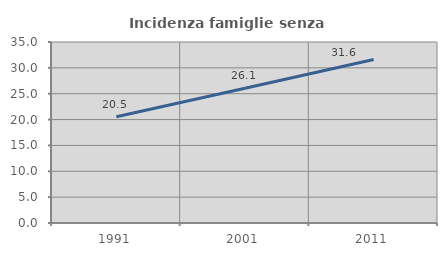
| Category | Incidenza famiglie senza nuclei |
|---|---|
| 1991.0 | 20.535 |
| 2001.0 | 26.072 |
| 2011.0 | 31.617 |